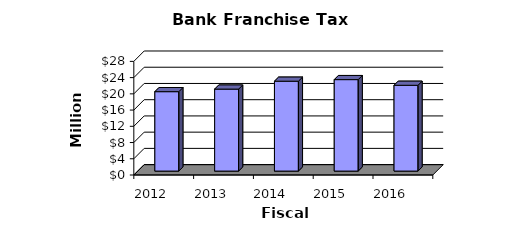
| Category | Series 0 |
|---|---|
| 2012.0 | 19570000 |
| 2013.0 | 20202000 |
| 2014.0 | 22149000 |
| 2015.0 | 22539000 |
| 2016.0 | 21142000 |